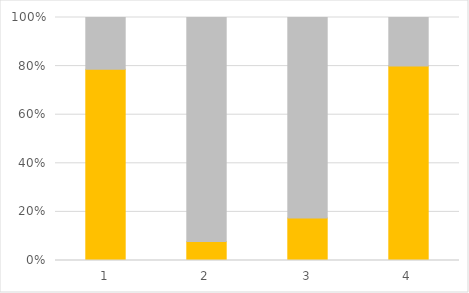
| Category | division | no division |
|---|---|---|
| 0 | 78.689 | 21.311 |
| 1 | 7.792 | 92.208 |
| 2 | 17.46 | 82.54 |
| 3 | 80 | 20 |